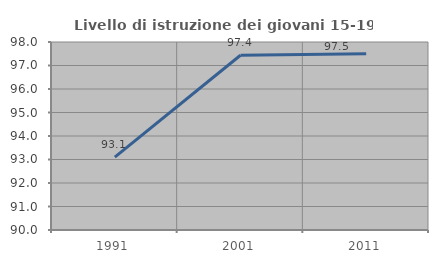
| Category | Livello di istruzione dei giovani 15-19 anni |
|---|---|
| 1991.0 | 93.103 |
| 2001.0 | 97.436 |
| 2011.0 | 97.5 |